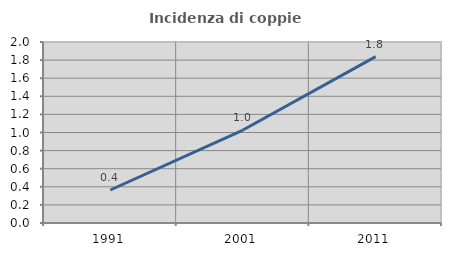
| Category | Incidenza di coppie miste |
|---|---|
| 1991.0 | 0.365 |
| 2001.0 | 1.027 |
| 2011.0 | 1.838 |